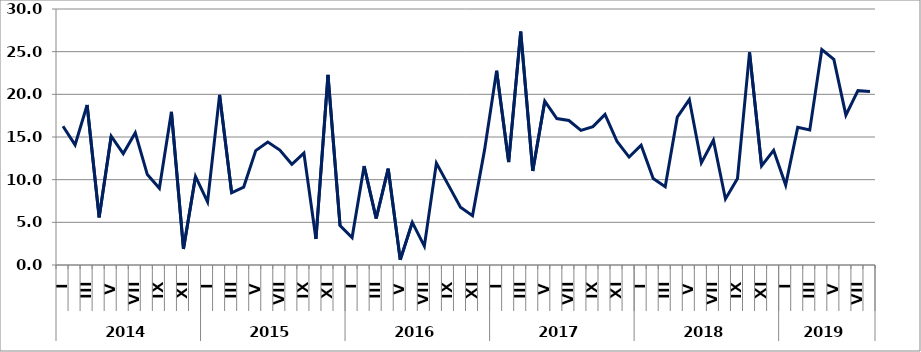
| Category | დღგ-ს  გადამხდელ  საწარმოთა  ბრუნვის ცვლილება (%) |
|---|---|
| 0 | 16.26 |
| 1 | 14.081 |
| 2 | 18.749 |
| 3 | 5.578 |
| 4 | 15.095 |
| 5 | 13.057 |
| 6 | 15.484 |
| 7 | 10.592 |
| 8 | 8.989 |
| 9 | 17.953 |
| 10 | 1.884 |
| 11 | 10.38 |
| 12 | 7.405 |
| 13 | 19.944 |
| 14 | 8.466 |
| 15 | 9.132 |
| 16 | 13.408 |
| 17 | 14.407 |
| 18 | 13.472 |
| 19 | 11.803 |
| 20 | 13.113 |
| 21 | 3.049 |
| 22 | 22.285 |
| 23 | 4.614 |
| 24 | 3.216 |
| 25 | 11.594 |
| 26 | 5.449 |
| 27 | 11.283 |
| 28 | 0.603 |
| 29 | 4.993 |
| 30 | 2.209 |
| 31 | 11.948 |
| 32 | 9.361 |
| 33 | 6.774 |
| 34 | 5.784 |
| 35 | 13.489 |
| 36 | 22.77 |
| 37 | 12.068 |
| 38 | 27.351 |
| 39 | 11.016 |
| 40 | 19.192 |
| 41 | 17.166 |
| 42 | 16.931 |
| 43 | 15.784 |
| 44 | 16.214 |
| 45 | 17.645 |
| 46 | 14.468 |
| 47 | 12.647 |
| 48 | 14.048 |
| 49 | 10.14 |
| 50 | 9.18 |
| 51 | 17.321 |
| 52 | 19.388 |
| 53 | 11.971 |
| 54 | 14.625 |
| 55 | 7.737 |
| 56 | 10.135 |
| 57 | 24.921 |
| 58 | 11.61 |
| 59 | 13.433 |
| 60 | 9.37 |
| 61 | 16.133 |
| 62 | 15.826 |
| 63 | 25.244 |
| 64 | 24.094 |
| 65 | 17.561 |
| 66 | 20.429 |
| 67 | 20.337 |